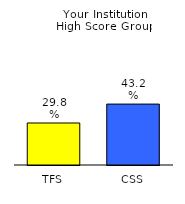
| Category | Series 0 |
|---|---|
| TFS | 0.298 |
| CSS | 0.432 |